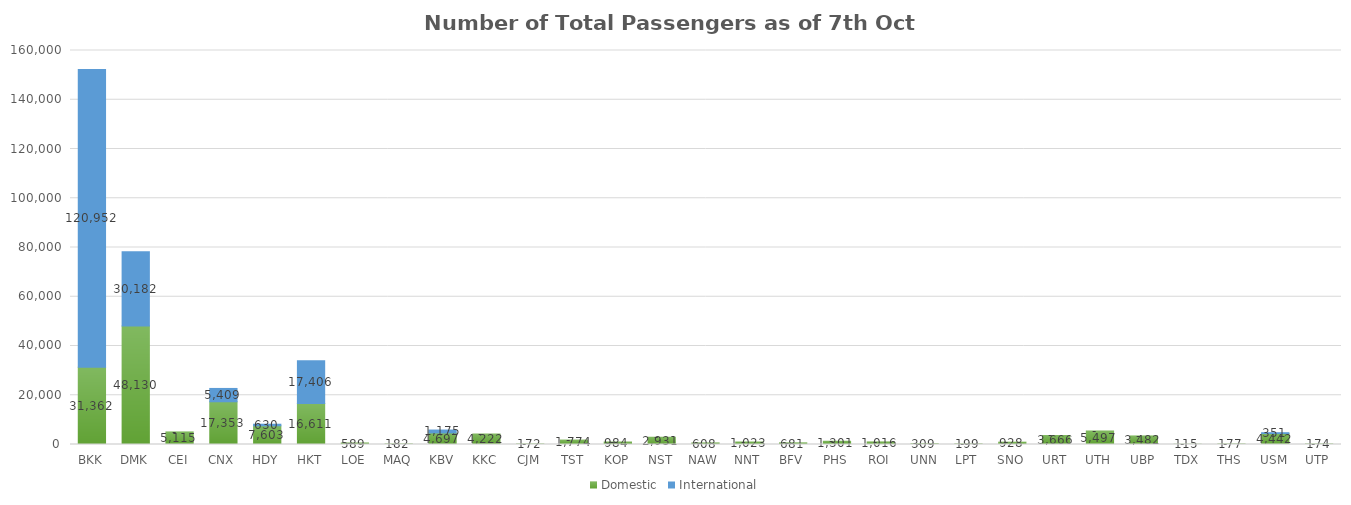
| Category | Domestic | International |
|---|---|---|
| BKK | 31362 | 120952 |
| DMK | 48130 | 30182 |
| CEI | 5115 | 0 |
| CNX | 17353 | 5409 |
| HDY | 7603 | 630 |
| HKT | 16611 | 17406 |
| LOE | 589 | 0 |
| MAQ | 182 | 0 |
| KBV | 4697 | 1175 |
| KKC | 4222 | 0 |
| CJM | 172 | 0 |
| TST | 1774 | 0 |
| KOP | 984 | 0 |
| NST | 2931 | 0 |
| NAW | 608 | 0 |
| NNT | 1023 | 0 |
| BFV | 681 | 0 |
| PHS | 1301 | 0 |
| ROI | 1016 | 0 |
| UNN | 309 | 0 |
| LPT | 199 | 0 |
| SNO | 928 | 0 |
| URT | 3666 | 0 |
| UTH | 5497 | 0 |
| UBP | 3482 | 0 |
| TDX | 115 | 0 |
| THS | 177 | 0 |
| USM | 4442 | 351 |
| UTP | 174 | 0 |